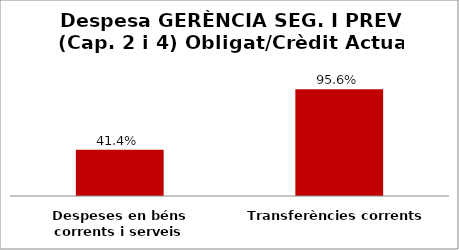
| Category | Series 0 |
|---|---|
| Despeses en béns corrents i serveis | 0.414 |
| Transferències corrents | 0.956 |